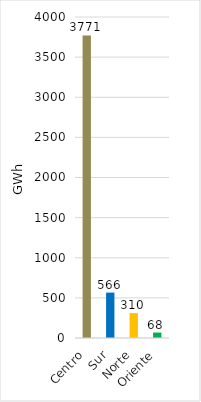
| Category | Series 0 |
|---|---|
| Centro | 3770.856 |
| Sur | 565.708 |
| Norte | 310.283 |
| Oriente | 68.02 |